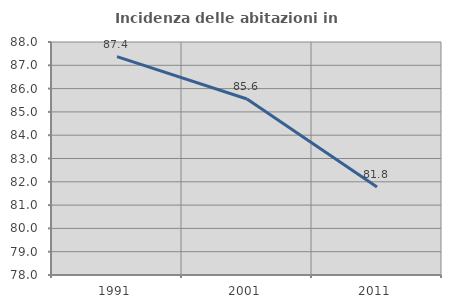
| Category | Incidenza delle abitazioni in proprietà  |
|---|---|
| 1991.0 | 87.373 |
| 2001.0 | 85.553 |
| 2011.0 | 81.774 |